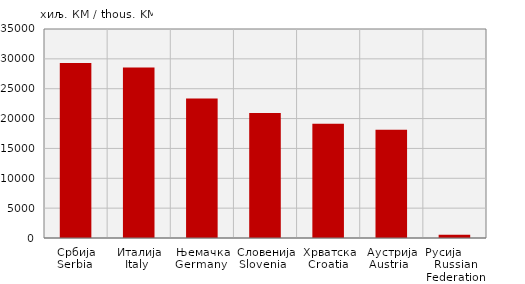
| Category | Извоз
Export |
|---|---|
| Србија
Serbia  | 29304 |
| Италија
Italy  | 28561 |
| Њемачка
Germany  | 23377 |
| Словенија
Slovenia   | 20913 |
| Хрватска
Croatia  | 19125 |
| Аустрија
Austria   | 18146 |
| Русија        Russian Federation | 558 |